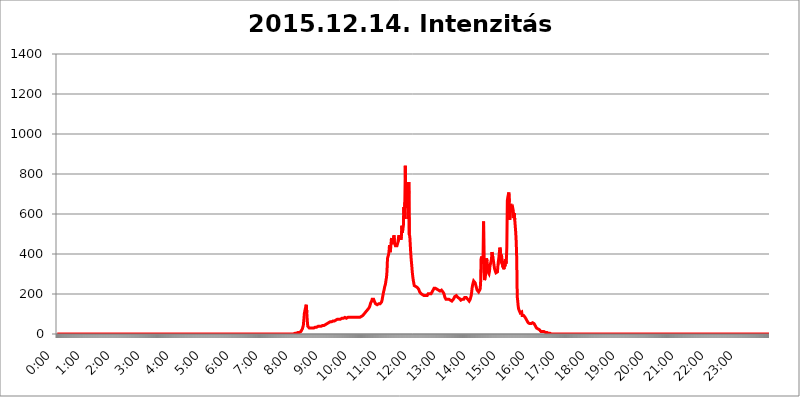
| Category | 2015.12.14. Intenzitás [W/m^2] |
|---|---|
| 0.0 | 0 |
| 0.0006944444444444445 | 0 |
| 0.001388888888888889 | 0 |
| 0.0020833333333333333 | 0 |
| 0.002777777777777778 | 0 |
| 0.003472222222222222 | 0 |
| 0.004166666666666667 | 0 |
| 0.004861111111111111 | 0 |
| 0.005555555555555556 | 0 |
| 0.0062499999999999995 | 0 |
| 0.006944444444444444 | 0 |
| 0.007638888888888889 | 0 |
| 0.008333333333333333 | 0 |
| 0.009027777777777779 | 0 |
| 0.009722222222222222 | 0 |
| 0.010416666666666666 | 0 |
| 0.011111111111111112 | 0 |
| 0.011805555555555555 | 0 |
| 0.012499999999999999 | 0 |
| 0.013194444444444444 | 0 |
| 0.013888888888888888 | 0 |
| 0.014583333333333332 | 0 |
| 0.015277777777777777 | 0 |
| 0.015972222222222224 | 0 |
| 0.016666666666666666 | 0 |
| 0.017361111111111112 | 0 |
| 0.018055555555555557 | 0 |
| 0.01875 | 0 |
| 0.019444444444444445 | 0 |
| 0.02013888888888889 | 0 |
| 0.020833333333333332 | 0 |
| 0.02152777777777778 | 0 |
| 0.022222222222222223 | 0 |
| 0.02291666666666667 | 0 |
| 0.02361111111111111 | 0 |
| 0.024305555555555556 | 0 |
| 0.024999999999999998 | 0 |
| 0.025694444444444447 | 0 |
| 0.02638888888888889 | 0 |
| 0.027083333333333334 | 0 |
| 0.027777777777777776 | 0 |
| 0.02847222222222222 | 0 |
| 0.029166666666666664 | 0 |
| 0.029861111111111113 | 0 |
| 0.030555555555555555 | 0 |
| 0.03125 | 0 |
| 0.03194444444444445 | 0 |
| 0.03263888888888889 | 0 |
| 0.03333333333333333 | 0 |
| 0.034027777777777775 | 0 |
| 0.034722222222222224 | 0 |
| 0.035416666666666666 | 0 |
| 0.036111111111111115 | 0 |
| 0.03680555555555556 | 0 |
| 0.0375 | 0 |
| 0.03819444444444444 | 0 |
| 0.03888888888888889 | 0 |
| 0.03958333333333333 | 0 |
| 0.04027777777777778 | 0 |
| 0.04097222222222222 | 0 |
| 0.041666666666666664 | 0 |
| 0.042361111111111106 | 0 |
| 0.04305555555555556 | 0 |
| 0.043750000000000004 | 0 |
| 0.044444444444444446 | 0 |
| 0.04513888888888889 | 0 |
| 0.04583333333333334 | 0 |
| 0.04652777777777778 | 0 |
| 0.04722222222222222 | 0 |
| 0.04791666666666666 | 0 |
| 0.04861111111111111 | 0 |
| 0.049305555555555554 | 0 |
| 0.049999999999999996 | 0 |
| 0.05069444444444445 | 0 |
| 0.051388888888888894 | 0 |
| 0.052083333333333336 | 0 |
| 0.05277777777777778 | 0 |
| 0.05347222222222222 | 0 |
| 0.05416666666666667 | 0 |
| 0.05486111111111111 | 0 |
| 0.05555555555555555 | 0 |
| 0.05625 | 0 |
| 0.05694444444444444 | 0 |
| 0.057638888888888885 | 0 |
| 0.05833333333333333 | 0 |
| 0.05902777777777778 | 0 |
| 0.059722222222222225 | 0 |
| 0.06041666666666667 | 0 |
| 0.061111111111111116 | 0 |
| 0.06180555555555556 | 0 |
| 0.0625 | 0 |
| 0.06319444444444444 | 0 |
| 0.06388888888888888 | 0 |
| 0.06458333333333334 | 0 |
| 0.06527777777777778 | 0 |
| 0.06597222222222222 | 0 |
| 0.06666666666666667 | 0 |
| 0.06736111111111111 | 0 |
| 0.06805555555555555 | 0 |
| 0.06874999999999999 | 0 |
| 0.06944444444444443 | 0 |
| 0.07013888888888889 | 0 |
| 0.07083333333333333 | 0 |
| 0.07152777777777779 | 0 |
| 0.07222222222222223 | 0 |
| 0.07291666666666667 | 0 |
| 0.07361111111111111 | 0 |
| 0.07430555555555556 | 0 |
| 0.075 | 0 |
| 0.07569444444444444 | 0 |
| 0.0763888888888889 | 0 |
| 0.07708333333333334 | 0 |
| 0.07777777777777778 | 0 |
| 0.07847222222222222 | 0 |
| 0.07916666666666666 | 0 |
| 0.0798611111111111 | 0 |
| 0.08055555555555556 | 0 |
| 0.08125 | 0 |
| 0.08194444444444444 | 0 |
| 0.08263888888888889 | 0 |
| 0.08333333333333333 | 0 |
| 0.08402777777777777 | 0 |
| 0.08472222222222221 | 0 |
| 0.08541666666666665 | 0 |
| 0.08611111111111112 | 0 |
| 0.08680555555555557 | 0 |
| 0.08750000000000001 | 0 |
| 0.08819444444444445 | 0 |
| 0.08888888888888889 | 0 |
| 0.08958333333333333 | 0 |
| 0.09027777777777778 | 0 |
| 0.09097222222222222 | 0 |
| 0.09166666666666667 | 0 |
| 0.09236111111111112 | 0 |
| 0.09305555555555556 | 0 |
| 0.09375 | 0 |
| 0.09444444444444444 | 0 |
| 0.09513888888888888 | 0 |
| 0.09583333333333333 | 0 |
| 0.09652777777777777 | 0 |
| 0.09722222222222222 | 0 |
| 0.09791666666666667 | 0 |
| 0.09861111111111111 | 0 |
| 0.09930555555555555 | 0 |
| 0.09999999999999999 | 0 |
| 0.10069444444444443 | 0 |
| 0.1013888888888889 | 0 |
| 0.10208333333333335 | 0 |
| 0.10277777777777779 | 0 |
| 0.10347222222222223 | 0 |
| 0.10416666666666667 | 0 |
| 0.10486111111111111 | 0 |
| 0.10555555555555556 | 0 |
| 0.10625 | 0 |
| 0.10694444444444444 | 0 |
| 0.1076388888888889 | 0 |
| 0.10833333333333334 | 0 |
| 0.10902777777777778 | 0 |
| 0.10972222222222222 | 0 |
| 0.1111111111111111 | 0 |
| 0.11180555555555556 | 0 |
| 0.11180555555555556 | 0 |
| 0.1125 | 0 |
| 0.11319444444444444 | 0 |
| 0.11388888888888889 | 0 |
| 0.11458333333333333 | 0 |
| 0.11527777777777777 | 0 |
| 0.11597222222222221 | 0 |
| 0.11666666666666665 | 0 |
| 0.1173611111111111 | 0 |
| 0.11805555555555557 | 0 |
| 0.11944444444444445 | 0 |
| 0.12013888888888889 | 0 |
| 0.12083333333333333 | 0 |
| 0.12152777777777778 | 0 |
| 0.12222222222222223 | 0 |
| 0.12291666666666667 | 0 |
| 0.12291666666666667 | 0 |
| 0.12361111111111112 | 0 |
| 0.12430555555555556 | 0 |
| 0.125 | 0 |
| 0.12569444444444444 | 0 |
| 0.12638888888888888 | 0 |
| 0.12708333333333333 | 0 |
| 0.16875 | 0 |
| 0.12847222222222224 | 0 |
| 0.12916666666666668 | 0 |
| 0.12986111111111112 | 0 |
| 0.13055555555555556 | 0 |
| 0.13125 | 0 |
| 0.13194444444444445 | 0 |
| 0.1326388888888889 | 0 |
| 0.13333333333333333 | 0 |
| 0.13402777777777777 | 0 |
| 0.13402777777777777 | 0 |
| 0.13472222222222222 | 0 |
| 0.13541666666666666 | 0 |
| 0.1361111111111111 | 0 |
| 0.13749999999999998 | 0 |
| 0.13819444444444443 | 0 |
| 0.1388888888888889 | 0 |
| 0.13958333333333334 | 0 |
| 0.14027777777777778 | 0 |
| 0.14097222222222222 | 0 |
| 0.14166666666666666 | 0 |
| 0.1423611111111111 | 0 |
| 0.14305555555555557 | 0 |
| 0.14375000000000002 | 0 |
| 0.14444444444444446 | 0 |
| 0.1451388888888889 | 0 |
| 0.1451388888888889 | 0 |
| 0.14652777777777778 | 0 |
| 0.14722222222222223 | 0 |
| 0.14791666666666667 | 0 |
| 0.1486111111111111 | 0 |
| 0.14930555555555555 | 0 |
| 0.15 | 0 |
| 0.15069444444444444 | 0 |
| 0.15138888888888888 | 0 |
| 0.15208333333333332 | 0 |
| 0.15277777777777776 | 0 |
| 0.15347222222222223 | 0 |
| 0.15416666666666667 | 0 |
| 0.15486111111111112 | 0 |
| 0.15555555555555556 | 0 |
| 0.15625 | 0 |
| 0.15694444444444444 | 0 |
| 0.15763888888888888 | 0 |
| 0.15833333333333333 | 0 |
| 0.15902777777777777 | 0 |
| 0.15972222222222224 | 0 |
| 0.16041666666666668 | 0 |
| 0.16111111111111112 | 0 |
| 0.16180555555555556 | 0 |
| 0.1625 | 0 |
| 0.16319444444444445 | 0 |
| 0.1638888888888889 | 0 |
| 0.16458333333333333 | 0 |
| 0.16527777777777777 | 0 |
| 0.16597222222222222 | 0 |
| 0.16666666666666666 | 0 |
| 0.1673611111111111 | 0 |
| 0.16805555555555554 | 0 |
| 0.16874999999999998 | 0 |
| 0.16944444444444443 | 0 |
| 0.17013888888888887 | 0 |
| 0.1708333333333333 | 0 |
| 0.17152777777777775 | 0 |
| 0.17222222222222225 | 0 |
| 0.1729166666666667 | 0 |
| 0.17361111111111113 | 0 |
| 0.17430555555555557 | 0 |
| 0.17500000000000002 | 0 |
| 0.17569444444444446 | 0 |
| 0.1763888888888889 | 0 |
| 0.17708333333333334 | 0 |
| 0.17777777777777778 | 0 |
| 0.17847222222222223 | 0 |
| 0.17916666666666667 | 0 |
| 0.1798611111111111 | 0 |
| 0.18055555555555555 | 0 |
| 0.18125 | 0 |
| 0.18194444444444444 | 0 |
| 0.1826388888888889 | 0 |
| 0.18333333333333335 | 0 |
| 0.1840277777777778 | 0 |
| 0.18472222222222223 | 0 |
| 0.18541666666666667 | 0 |
| 0.18611111111111112 | 0 |
| 0.18680555555555556 | 0 |
| 0.1875 | 0 |
| 0.18819444444444444 | 0 |
| 0.18888888888888888 | 0 |
| 0.18958333333333333 | 0 |
| 0.19027777777777777 | 0 |
| 0.1909722222222222 | 0 |
| 0.19166666666666665 | 0 |
| 0.19236111111111112 | 0 |
| 0.19305555555555554 | 0 |
| 0.19375 | 0 |
| 0.19444444444444445 | 0 |
| 0.1951388888888889 | 0 |
| 0.19583333333333333 | 0 |
| 0.19652777777777777 | 0 |
| 0.19722222222222222 | 0 |
| 0.19791666666666666 | 0 |
| 0.1986111111111111 | 0 |
| 0.19930555555555554 | 0 |
| 0.19999999999999998 | 0 |
| 0.20069444444444443 | 0 |
| 0.20138888888888887 | 0 |
| 0.2020833333333333 | 0 |
| 0.2027777777777778 | 0 |
| 0.2034722222222222 | 0 |
| 0.2041666666666667 | 0 |
| 0.20486111111111113 | 0 |
| 0.20555555555555557 | 0 |
| 0.20625000000000002 | 0 |
| 0.20694444444444446 | 0 |
| 0.2076388888888889 | 0 |
| 0.20833333333333334 | 0 |
| 0.20902777777777778 | 0 |
| 0.20972222222222223 | 0 |
| 0.21041666666666667 | 0 |
| 0.2111111111111111 | 0 |
| 0.21180555555555555 | 0 |
| 0.2125 | 0 |
| 0.21319444444444444 | 0 |
| 0.2138888888888889 | 0 |
| 0.21458333333333335 | 0 |
| 0.2152777777777778 | 0 |
| 0.21597222222222223 | 0 |
| 0.21666666666666667 | 0 |
| 0.21736111111111112 | 0 |
| 0.21805555555555556 | 0 |
| 0.21875 | 0 |
| 0.21944444444444444 | 0 |
| 0.22013888888888888 | 0 |
| 0.22083333333333333 | 0 |
| 0.22152777777777777 | 0 |
| 0.2222222222222222 | 0 |
| 0.22291666666666665 | 0 |
| 0.2236111111111111 | 0 |
| 0.22430555555555556 | 0 |
| 0.225 | 0 |
| 0.22569444444444445 | 0 |
| 0.2263888888888889 | 0 |
| 0.22708333333333333 | 0 |
| 0.22777777777777777 | 0 |
| 0.22847222222222222 | 0 |
| 0.22916666666666666 | 0 |
| 0.2298611111111111 | 0 |
| 0.23055555555555554 | 0 |
| 0.23124999999999998 | 0 |
| 0.23194444444444443 | 0 |
| 0.23263888888888887 | 0 |
| 0.2333333333333333 | 0 |
| 0.2340277777777778 | 0 |
| 0.2347222222222222 | 0 |
| 0.2354166666666667 | 0 |
| 0.23611111111111113 | 0 |
| 0.23680555555555557 | 0 |
| 0.23750000000000002 | 0 |
| 0.23819444444444446 | 0 |
| 0.2388888888888889 | 0 |
| 0.23958333333333334 | 0 |
| 0.24027777777777778 | 0 |
| 0.24097222222222223 | 0 |
| 0.24166666666666667 | 0 |
| 0.2423611111111111 | 0 |
| 0.24305555555555555 | 0 |
| 0.24375 | 0 |
| 0.24444444444444446 | 0 |
| 0.24513888888888888 | 0 |
| 0.24583333333333335 | 0 |
| 0.2465277777777778 | 0 |
| 0.24722222222222223 | 0 |
| 0.24791666666666667 | 0 |
| 0.24861111111111112 | 0 |
| 0.24930555555555556 | 0 |
| 0.25 | 0 |
| 0.25069444444444444 | 0 |
| 0.2513888888888889 | 0 |
| 0.2520833333333333 | 0 |
| 0.25277777777777777 | 0 |
| 0.2534722222222222 | 0 |
| 0.25416666666666665 | 0 |
| 0.2548611111111111 | 0 |
| 0.2555555555555556 | 0 |
| 0.25625000000000003 | 0 |
| 0.2569444444444445 | 0 |
| 0.2576388888888889 | 0 |
| 0.25833333333333336 | 0 |
| 0.2590277777777778 | 0 |
| 0.25972222222222224 | 0 |
| 0.2604166666666667 | 0 |
| 0.2611111111111111 | 0 |
| 0.26180555555555557 | 0 |
| 0.2625 | 0 |
| 0.26319444444444445 | 0 |
| 0.2638888888888889 | 0 |
| 0.26458333333333334 | 0 |
| 0.2652777777777778 | 0 |
| 0.2659722222222222 | 0 |
| 0.26666666666666666 | 0 |
| 0.2673611111111111 | 0 |
| 0.26805555555555555 | 0 |
| 0.26875 | 0 |
| 0.26944444444444443 | 0 |
| 0.2701388888888889 | 0 |
| 0.2708333333333333 | 0 |
| 0.27152777777777776 | 0 |
| 0.2722222222222222 | 0 |
| 0.27291666666666664 | 0 |
| 0.2736111111111111 | 0 |
| 0.2743055555555555 | 0 |
| 0.27499999999999997 | 0 |
| 0.27569444444444446 | 0 |
| 0.27638888888888885 | 0 |
| 0.27708333333333335 | 0 |
| 0.2777777777777778 | 0 |
| 0.27847222222222223 | 0 |
| 0.2791666666666667 | 0 |
| 0.2798611111111111 | 0 |
| 0.28055555555555556 | 0 |
| 0.28125 | 0 |
| 0.28194444444444444 | 0 |
| 0.2826388888888889 | 0 |
| 0.2833333333333333 | 0 |
| 0.28402777777777777 | 0 |
| 0.2847222222222222 | 0 |
| 0.28541666666666665 | 0 |
| 0.28611111111111115 | 0 |
| 0.28680555555555554 | 0 |
| 0.28750000000000003 | 0 |
| 0.2881944444444445 | 0 |
| 0.2888888888888889 | 0 |
| 0.28958333333333336 | 0 |
| 0.2902777777777778 | 0 |
| 0.29097222222222224 | 0 |
| 0.2916666666666667 | 0 |
| 0.2923611111111111 | 0 |
| 0.29305555555555557 | 0 |
| 0.29375 | 0 |
| 0.29444444444444445 | 0 |
| 0.2951388888888889 | 0 |
| 0.29583333333333334 | 0 |
| 0.2965277777777778 | 0 |
| 0.2972222222222222 | 0 |
| 0.29791666666666666 | 0 |
| 0.2986111111111111 | 0 |
| 0.29930555555555555 | 0 |
| 0.3 | 0 |
| 0.30069444444444443 | 0 |
| 0.3013888888888889 | 0 |
| 0.3020833333333333 | 0 |
| 0.30277777777777776 | 0 |
| 0.3034722222222222 | 0 |
| 0.30416666666666664 | 0 |
| 0.3048611111111111 | 0 |
| 0.3055555555555555 | 0 |
| 0.30624999999999997 | 0 |
| 0.3069444444444444 | 0 |
| 0.3076388888888889 | 0 |
| 0.30833333333333335 | 0 |
| 0.3090277777777778 | 0 |
| 0.30972222222222223 | 0 |
| 0.3104166666666667 | 0 |
| 0.3111111111111111 | 0 |
| 0.31180555555555556 | 0 |
| 0.3125 | 0 |
| 0.31319444444444444 | 0 |
| 0.3138888888888889 | 0 |
| 0.3145833333333333 | 0 |
| 0.31527777777777777 | 0 |
| 0.3159722222222222 | 0 |
| 0.31666666666666665 | 0 |
| 0.31736111111111115 | 0 |
| 0.31805555555555554 | 0 |
| 0.31875000000000003 | 0 |
| 0.3194444444444445 | 0 |
| 0.3201388888888889 | 0 |
| 0.32083333333333336 | 0 |
| 0.3215277777777778 | 0 |
| 0.32222222222222224 | 0 |
| 0.3229166666666667 | 0 |
| 0.3236111111111111 | 0 |
| 0.32430555555555557 | 0 |
| 0.325 | 0 |
| 0.32569444444444445 | 0 |
| 0.3263888888888889 | 0 |
| 0.32708333333333334 | 0 |
| 0.3277777777777778 | 0 |
| 0.3284722222222222 | 0 |
| 0.32916666666666666 | 0 |
| 0.3298611111111111 | 0 |
| 0.33055555555555555 | 0 |
| 0.33125 | 0 |
| 0.33194444444444443 | 0 |
| 0.3326388888888889 | 3.525 |
| 0.3333333333333333 | 3.525 |
| 0.3340277777777778 | 3.525 |
| 0.3347222222222222 | 3.525 |
| 0.3354166666666667 | 3.525 |
| 0.3361111111111111 | 3.525 |
| 0.3368055555555556 | 3.525 |
| 0.33749999999999997 | 7.887 |
| 0.33819444444444446 | 7.887 |
| 0.33888888888888885 | 7.887 |
| 0.33958333333333335 | 7.887 |
| 0.34027777777777773 | 7.887 |
| 0.34097222222222223 | 12.257 |
| 0.3416666666666666 | 12.257 |
| 0.3423611111111111 | 12.257 |
| 0.3430555555555555 | 16.636 |
| 0.34375 | 25.419 |
| 0.3444444444444445 | 34.234 |
| 0.3451388888888889 | 43.079 |
| 0.3458333333333334 | 69.775 |
| 0.34652777777777777 | 101.184 |
| 0.34722222222222227 | 114.716 |
| 0.34791666666666665 | 119.235 |
| 0.34861111111111115 | 137.347 |
| 0.34930555555555554 | 146.423 |
| 0.35000000000000003 | 105.69 |
| 0.3506944444444444 | 65.31 |
| 0.3513888888888889 | 38.653 |
| 0.3520833333333333 | 38.653 |
| 0.3527777777777778 | 34.234 |
| 0.3534722222222222 | 29.823 |
| 0.3541666666666667 | 29.823 |
| 0.3548611111111111 | 29.823 |
| 0.35555555555555557 | 29.823 |
| 0.35625 | 29.823 |
| 0.35694444444444445 | 29.823 |
| 0.3576388888888889 | 29.823 |
| 0.35833333333333334 | 29.823 |
| 0.3590277777777778 | 29.823 |
| 0.3597222222222222 | 29.823 |
| 0.36041666666666666 | 29.823 |
| 0.3611111111111111 | 29.823 |
| 0.36180555555555555 | 34.234 |
| 0.3625 | 34.234 |
| 0.36319444444444443 | 34.234 |
| 0.3638888888888889 | 34.234 |
| 0.3645833333333333 | 34.234 |
| 0.3652777777777778 | 38.653 |
| 0.3659722222222222 | 38.653 |
| 0.3666666666666667 | 38.653 |
| 0.3673611111111111 | 38.653 |
| 0.3680555555555556 | 38.653 |
| 0.36874999999999997 | 38.653 |
| 0.36944444444444446 | 38.653 |
| 0.37013888888888885 | 38.653 |
| 0.37083333333333335 | 38.653 |
| 0.37152777777777773 | 38.653 |
| 0.37222222222222223 | 43.079 |
| 0.3729166666666666 | 43.079 |
| 0.3736111111111111 | 43.079 |
| 0.3743055555555555 | 43.079 |
| 0.375 | 47.511 |
| 0.3756944444444445 | 47.511 |
| 0.3763888888888889 | 47.511 |
| 0.3770833333333334 | 47.511 |
| 0.37777777777777777 | 51.951 |
| 0.37847222222222227 | 51.951 |
| 0.37916666666666665 | 56.398 |
| 0.37986111111111115 | 56.398 |
| 0.38055555555555554 | 56.398 |
| 0.38125000000000003 | 56.398 |
| 0.3819444444444444 | 60.85 |
| 0.3826388888888889 | 60.85 |
| 0.3833333333333333 | 60.85 |
| 0.3840277777777778 | 60.85 |
| 0.3847222222222222 | 60.85 |
| 0.3854166666666667 | 60.85 |
| 0.3861111111111111 | 60.85 |
| 0.38680555555555557 | 65.31 |
| 0.3875 | 65.31 |
| 0.38819444444444445 | 65.31 |
| 0.3888888888888889 | 65.31 |
| 0.38958333333333334 | 69.775 |
| 0.3902777777777778 | 69.775 |
| 0.3909722222222222 | 69.775 |
| 0.39166666666666666 | 74.246 |
| 0.3923611111111111 | 74.246 |
| 0.39305555555555555 | 74.246 |
| 0.39375 | 74.246 |
| 0.39444444444444443 | 74.246 |
| 0.3951388888888889 | 74.246 |
| 0.3958333333333333 | 74.246 |
| 0.3965277777777778 | 74.246 |
| 0.3972222222222222 | 74.246 |
| 0.3979166666666667 | 74.246 |
| 0.3986111111111111 | 74.246 |
| 0.3993055555555556 | 78.722 |
| 0.39999999999999997 | 78.722 |
| 0.40069444444444446 | 78.722 |
| 0.40138888888888885 | 78.722 |
| 0.40208333333333335 | 78.722 |
| 0.40277777777777773 | 78.722 |
| 0.40347222222222223 | 83.205 |
| 0.4041666666666666 | 83.205 |
| 0.4048611111111111 | 83.205 |
| 0.4055555555555555 | 78.722 |
| 0.40625 | 78.722 |
| 0.4069444444444445 | 83.205 |
| 0.4076388888888889 | 83.205 |
| 0.4083333333333334 | 83.205 |
| 0.40902777777777777 | 83.205 |
| 0.40972222222222227 | 83.205 |
| 0.41041666666666665 | 83.205 |
| 0.41111111111111115 | 83.205 |
| 0.41180555555555554 | 83.205 |
| 0.41250000000000003 | 83.205 |
| 0.4131944444444444 | 83.205 |
| 0.4138888888888889 | 83.205 |
| 0.4145833333333333 | 83.205 |
| 0.4152777777777778 | 83.205 |
| 0.4159722222222222 | 83.205 |
| 0.4166666666666667 | 83.205 |
| 0.4173611111111111 | 83.205 |
| 0.41805555555555557 | 83.205 |
| 0.41875 | 83.205 |
| 0.41944444444444445 | 83.205 |
| 0.4201388888888889 | 83.205 |
| 0.42083333333333334 | 83.205 |
| 0.4215277777777778 | 83.205 |
| 0.4222222222222222 | 83.205 |
| 0.42291666666666666 | 83.205 |
| 0.4236111111111111 | 83.205 |
| 0.42430555555555555 | 83.205 |
| 0.425 | 83.205 |
| 0.42569444444444443 | 87.692 |
| 0.4263888888888889 | 87.692 |
| 0.4270833333333333 | 92.184 |
| 0.4277777777777778 | 92.184 |
| 0.4284722222222222 | 92.184 |
| 0.4291666666666667 | 96.682 |
| 0.4298611111111111 | 96.682 |
| 0.4305555555555556 | 101.184 |
| 0.43124999999999997 | 105.69 |
| 0.43194444444444446 | 105.69 |
| 0.43263888888888885 | 110.201 |
| 0.43333333333333335 | 110.201 |
| 0.43402777777777773 | 114.716 |
| 0.43472222222222223 | 119.235 |
| 0.4354166666666666 | 119.235 |
| 0.4361111111111111 | 123.758 |
| 0.4368055555555555 | 128.284 |
| 0.4375 | 132.814 |
| 0.4381944444444445 | 137.347 |
| 0.4388888888888889 | 146.423 |
| 0.4395833333333334 | 155.509 |
| 0.44027777777777777 | 160.056 |
| 0.44097222222222227 | 164.605 |
| 0.44166666666666665 | 173.709 |
| 0.44236111111111115 | 173.709 |
| 0.44305555555555554 | 173.709 |
| 0.44375000000000003 | 173.709 |
| 0.4444444444444444 | 169.156 |
| 0.4451388888888889 | 160.056 |
| 0.4458333333333333 | 155.509 |
| 0.4465277777777778 | 150.964 |
| 0.4472222222222222 | 146.423 |
| 0.4479166666666667 | 146.423 |
| 0.4486111111111111 | 146.423 |
| 0.44930555555555557 | 146.423 |
| 0.45 | 146.423 |
| 0.45069444444444445 | 150.964 |
| 0.4513888888888889 | 150.964 |
| 0.45208333333333334 | 150.964 |
| 0.4527777777777778 | 150.964 |
| 0.4534722222222222 | 150.964 |
| 0.45416666666666666 | 150.964 |
| 0.4548611111111111 | 160.056 |
| 0.45555555555555555 | 169.156 |
| 0.45625 | 182.82 |
| 0.45694444444444443 | 196.497 |
| 0.4576388888888889 | 210.182 |
| 0.4583333333333333 | 219.309 |
| 0.4590277777777778 | 233 |
| 0.4597222222222222 | 242.127 |
| 0.4604166666666667 | 251.251 |
| 0.4611111111111111 | 269.49 |
| 0.4618055555555556 | 283.156 |
| 0.46249999999999997 | 314.98 |
| 0.46319444444444446 | 378.224 |
| 0.46388888888888885 | 387.202 |
| 0.46458333333333335 | 396.164 |
| 0.46527777777777773 | 409.574 |
| 0.46597222222222223 | 445.129 |
| 0.4666666666666666 | 409.574 |
| 0.4673611111111111 | 418.492 |
| 0.4680555555555555 | 449.551 |
| 0.46875 | 480.356 |
| 0.4694444444444445 | 449.551 |
| 0.4701388888888889 | 449.551 |
| 0.4708333333333334 | 462.786 |
| 0.47152777777777777 | 471.582 |
| 0.47222222222222227 | 493.475 |
| 0.47291666666666665 | 458.38 |
| 0.47361111111111115 | 449.551 |
| 0.47430555555555554 | 440.702 |
| 0.47500000000000003 | 440.702 |
| 0.4756944444444444 | 436.27 |
| 0.4763888888888889 | 440.702 |
| 0.4770833333333333 | 445.129 |
| 0.4777777777777778 | 458.38 |
| 0.4784722222222222 | 475.972 |
| 0.4791666666666667 | 493.475 |
| 0.4798611111111111 | 484.735 |
| 0.48055555555555557 | 493.475 |
| 0.48125 | 497.836 |
| 0.48194444444444445 | 471.582 |
| 0.4826388888888889 | 489.108 |
| 0.48333333333333334 | 541.121 |
| 0.4840277777777778 | 506.542 |
| 0.4847222222222222 | 528.2 |
| 0.48541666666666666 | 536.82 |
| 0.4861111111111111 | 634.105 |
| 0.48680555555555555 | 575.299 |
| 0.4875 | 658.909 |
| 0.48819444444444443 | 841.526 |
| 0.4888888888888889 | 642.4 |
| 0.4895833333333333 | 650.667 |
| 0.4902777777777778 | 755.766 |
| 0.4909722222222222 | 727.896 |
| 0.4916666666666667 | 575.299 |
| 0.4923611111111111 | 583.779 |
| 0.4930555555555556 | 759.723 |
| 0.49374999999999997 | 497.836 |
| 0.49444444444444446 | 489.108 |
| 0.49513888888888885 | 493.475 |
| 0.49583333333333335 | 400.638 |
| 0.49652777777777773 | 369.23 |
| 0.49722222222222223 | 342.162 |
| 0.4979166666666666 | 310.44 |
| 0.4986111111111111 | 287.709 |
| 0.4993055555555555 | 269.49 |
| 0.5 | 255.813 |
| 0.5006944444444444 | 242.127 |
| 0.5013888888888889 | 237.564 |
| 0.5020833333333333 | 237.564 |
| 0.5027777777777778 | 237.564 |
| 0.5034722222222222 | 233 |
| 0.5041666666666667 | 233 |
| 0.5048611111111111 | 233 |
| 0.5055555555555555 | 233 |
| 0.50625 | 228.436 |
| 0.5069444444444444 | 223.873 |
| 0.5076388888888889 | 219.309 |
| 0.5083333333333333 | 210.182 |
| 0.5090277777777777 | 210.182 |
| 0.5097222222222222 | 205.62 |
| 0.5104166666666666 | 201.058 |
| 0.5111111111111112 | 201.058 |
| 0.5118055555555555 | 196.497 |
| 0.5125000000000001 | 196.497 |
| 0.5131944444444444 | 191.937 |
| 0.513888888888889 | 191.937 |
| 0.5145833333333333 | 191.937 |
| 0.5152777777777778 | 191.937 |
| 0.5159722222222222 | 191.937 |
| 0.5166666666666667 | 191.937 |
| 0.517361111111111 | 191.937 |
| 0.5180555555555556 | 187.378 |
| 0.5187499999999999 | 191.937 |
| 0.5194444444444445 | 196.497 |
| 0.5201388888888888 | 201.058 |
| 0.5208333333333334 | 201.058 |
| 0.5215277777777778 | 201.058 |
| 0.5222222222222223 | 201.058 |
| 0.5229166666666667 | 201.058 |
| 0.5236111111111111 | 201.058 |
| 0.5243055555555556 | 201.058 |
| 0.525 | 205.62 |
| 0.5256944444444445 | 210.182 |
| 0.5263888888888889 | 214.746 |
| 0.5270833333333333 | 219.309 |
| 0.5277777777777778 | 223.873 |
| 0.5284722222222222 | 228.436 |
| 0.5291666666666667 | 228.436 |
| 0.5298611111111111 | 228.436 |
| 0.5305555555555556 | 228.436 |
| 0.53125 | 228.436 |
| 0.5319444444444444 | 223.873 |
| 0.5326388888888889 | 223.873 |
| 0.5333333333333333 | 223.873 |
| 0.5340277777777778 | 223.873 |
| 0.5347222222222222 | 219.309 |
| 0.5354166666666667 | 214.746 |
| 0.5361111111111111 | 214.746 |
| 0.5368055555555555 | 214.746 |
| 0.5375 | 214.746 |
| 0.5381944444444444 | 214.746 |
| 0.5388888888888889 | 219.309 |
| 0.5395833333333333 | 214.746 |
| 0.5402777777777777 | 214.746 |
| 0.5409722222222222 | 210.182 |
| 0.5416666666666666 | 205.62 |
| 0.5423611111111112 | 201.058 |
| 0.5430555555555555 | 191.937 |
| 0.5437500000000001 | 182.82 |
| 0.5444444444444444 | 178.264 |
| 0.545138888888889 | 173.709 |
| 0.5458333333333333 | 173.709 |
| 0.5465277777777778 | 169.156 |
| 0.5472222222222222 | 173.709 |
| 0.5479166666666667 | 173.709 |
| 0.548611111111111 | 173.709 |
| 0.5493055555555556 | 173.709 |
| 0.5499999999999999 | 173.709 |
| 0.5506944444444445 | 173.709 |
| 0.5513888888888888 | 169.156 |
| 0.5520833333333334 | 169.156 |
| 0.5527777777777778 | 164.605 |
| 0.5534722222222223 | 164.605 |
| 0.5541666666666667 | 169.156 |
| 0.5548611111111111 | 169.156 |
| 0.5555555555555556 | 173.709 |
| 0.55625 | 178.264 |
| 0.5569444444444445 | 178.264 |
| 0.5576388888888889 | 187.378 |
| 0.5583333333333333 | 187.378 |
| 0.5590277777777778 | 191.937 |
| 0.5597222222222222 | 191.937 |
| 0.5604166666666667 | 191.937 |
| 0.5611111111111111 | 187.378 |
| 0.5618055555555556 | 182.82 |
| 0.5625 | 178.264 |
| 0.5631944444444444 | 178.264 |
| 0.5638888888888889 | 178.264 |
| 0.5645833333333333 | 178.264 |
| 0.5652777777777778 | 173.709 |
| 0.5659722222222222 | 169.156 |
| 0.5666666666666667 | 169.156 |
| 0.5673611111111111 | 169.156 |
| 0.5680555555555555 | 173.709 |
| 0.56875 | 173.709 |
| 0.5694444444444444 | 173.709 |
| 0.5701388888888889 | 173.709 |
| 0.5708333333333333 | 178.264 |
| 0.5715277777777777 | 182.82 |
| 0.5722222222222222 | 182.82 |
| 0.5729166666666666 | 187.378 |
| 0.5736111111111112 | 182.82 |
| 0.5743055555555555 | 182.82 |
| 0.5750000000000001 | 178.264 |
| 0.5756944444444444 | 173.709 |
| 0.576388888888889 | 169.156 |
| 0.5770833333333333 | 169.156 |
| 0.5777777777777778 | 164.605 |
| 0.5784722222222222 | 164.605 |
| 0.5791666666666667 | 173.709 |
| 0.579861111111111 | 182.82 |
| 0.5805555555555556 | 191.937 |
| 0.5812499999999999 | 210.182 |
| 0.5819444444444445 | 233 |
| 0.5826388888888888 | 246.689 |
| 0.5833333333333334 | 255.813 |
| 0.5840277777777778 | 264.932 |
| 0.5847222222222223 | 269.49 |
| 0.5854166666666667 | 264.932 |
| 0.5861111111111111 | 255.813 |
| 0.5868055555555556 | 246.689 |
| 0.5875 | 237.564 |
| 0.5881944444444445 | 228.436 |
| 0.5888888888888889 | 219.309 |
| 0.5895833333333333 | 214.746 |
| 0.5902777777777778 | 214.746 |
| 0.5909722222222222 | 210.182 |
| 0.5916666666666667 | 210.182 |
| 0.5923611111111111 | 214.746 |
| 0.5930555555555556 | 223.873 |
| 0.59375 | 251.251 |
| 0.5944444444444444 | 373.729 |
| 0.5951388888888889 | 387.202 |
| 0.5958333333333333 | 364.728 |
| 0.5965277777777778 | 351.198 |
| 0.5972222222222222 | 387.202 |
| 0.5979166666666667 | 562.53 |
| 0.5986111111111111 | 305.898 |
| 0.5993055555555555 | 269.49 |
| 0.6 | 278.603 |
| 0.6006944444444444 | 278.603 |
| 0.6013888888888889 | 310.44 |
| 0.6020833333333333 | 378.224 |
| 0.6027777777777777 | 364.728 |
| 0.6034722222222222 | 333.113 |
| 0.6041666666666666 | 310.44 |
| 0.6048611111111112 | 305.898 |
| 0.6055555555555555 | 301.354 |
| 0.6062500000000001 | 314.98 |
| 0.6069444444444444 | 342.162 |
| 0.607638888888889 | 351.198 |
| 0.6083333333333333 | 346.682 |
| 0.6090277777777778 | 373.729 |
| 0.6097222222222222 | 409.574 |
| 0.6104166666666667 | 414.035 |
| 0.611111111111111 | 378.224 |
| 0.6118055555555556 | 364.728 |
| 0.6124999999999999 | 369.23 |
| 0.6131944444444445 | 328.584 |
| 0.6138888888888888 | 319.517 |
| 0.6145833333333334 | 314.98 |
| 0.6152777777777778 | 305.898 |
| 0.6159722222222223 | 301.354 |
| 0.6166666666666667 | 301.354 |
| 0.6173611111111111 | 310.44 |
| 0.6180555555555556 | 342.162 |
| 0.61875 | 364.728 |
| 0.6194444444444445 | 382.715 |
| 0.6201388888888889 | 409.574 |
| 0.6208333333333333 | 431.833 |
| 0.6215277777777778 | 418.492 |
| 0.6222222222222222 | 369.23 |
| 0.6229166666666667 | 364.728 |
| 0.6236111111111111 | 378.224 |
| 0.6243055555555556 | 355.712 |
| 0.625 | 333.113 |
| 0.6256944444444444 | 364.728 |
| 0.6263888888888889 | 324.052 |
| 0.6270833333333333 | 364.728 |
| 0.6277777777777778 | 337.639 |
| 0.6284722222222222 | 373.729 |
| 0.6291666666666667 | 351.198 |
| 0.6298611111111111 | 364.728 |
| 0.6305555555555555 | 436.27 |
| 0.63125 | 667.123 |
| 0.6319444444444444 | 683.473 |
| 0.6326388888888889 | 695.666 |
| 0.6333333333333333 | 707.8 |
| 0.6340277777777777 | 658.909 |
| 0.6347222222222222 | 571.049 |
| 0.6354166666666666 | 642.4 |
| 0.6361111111111112 | 650.667 |
| 0.6368055555555555 | 638.256 |
| 0.6375000000000001 | 621.613 |
| 0.6381944444444444 | 617.436 |
| 0.638888888888889 | 629.948 |
| 0.6395833333333333 | 617.436 |
| 0.6402777777777778 | 579.542 |
| 0.6409722222222222 | 604.864 |
| 0.6416666666666667 | 571.049 |
| 0.642361111111111 | 566.793 |
| 0.6430555555555556 | 506.542 |
| 0.6437499999999999 | 458.38 |
| 0.6444444444444445 | 373.729 |
| 0.6451388888888888 | 187.378 |
| 0.6458333333333334 | 164.605 |
| 0.6465277777777778 | 137.347 |
| 0.6472222222222223 | 123.758 |
| 0.6479166666666667 | 119.235 |
| 0.6486111111111111 | 119.235 |
| 0.6493055555555556 | 105.69 |
| 0.65 | 101.184 |
| 0.6506944444444445 | 101.184 |
| 0.6513888888888889 | 110.201 |
| 0.6520833333333333 | 92.184 |
| 0.6527777777777778 | 87.692 |
| 0.6534722222222222 | 87.692 |
| 0.6541666666666667 | 92.184 |
| 0.6548611111111111 | 92.184 |
| 0.6555555555555556 | 87.692 |
| 0.65625 | 83.205 |
| 0.6569444444444444 | 78.722 |
| 0.6576388888888889 | 74.246 |
| 0.6583333333333333 | 69.775 |
| 0.6590277777777778 | 65.31 |
| 0.6597222222222222 | 60.85 |
| 0.6604166666666667 | 56.398 |
| 0.6611111111111111 | 56.398 |
| 0.6618055555555555 | 51.951 |
| 0.6625 | 51.951 |
| 0.6631944444444444 | 51.951 |
| 0.6638888888888889 | 51.951 |
| 0.6645833333333333 | 51.951 |
| 0.6652777777777777 | 51.951 |
| 0.6659722222222222 | 56.398 |
| 0.6666666666666666 | 56.398 |
| 0.6673611111111111 | 56.398 |
| 0.6680555555555556 | 51.951 |
| 0.6687500000000001 | 51.951 |
| 0.6694444444444444 | 56.398 |
| 0.6701388888888888 | 51.951 |
| 0.6708333333333334 | 38.653 |
| 0.6715277777777778 | 34.234 |
| 0.6722222222222222 | 29.823 |
| 0.6729166666666666 | 29.823 |
| 0.6736111111111112 | 25.419 |
| 0.6743055555555556 | 25.419 |
| 0.6749999999999999 | 21.024 |
| 0.6756944444444444 | 21.024 |
| 0.6763888888888889 | 21.024 |
| 0.6770833333333334 | 16.636 |
| 0.6777777777777777 | 16.636 |
| 0.6784722222222223 | 12.257 |
| 0.6791666666666667 | 12.257 |
| 0.6798611111111111 | 12.257 |
| 0.6805555555555555 | 12.257 |
| 0.68125 | 12.257 |
| 0.6819444444444445 | 12.257 |
| 0.6826388888888889 | 12.257 |
| 0.6833333333333332 | 12.257 |
| 0.6840277777777778 | 7.887 |
| 0.6847222222222222 | 7.887 |
| 0.6854166666666667 | 7.887 |
| 0.686111111111111 | 7.887 |
| 0.6868055555555556 | 7.887 |
| 0.6875 | 3.525 |
| 0.6881944444444444 | 3.525 |
| 0.688888888888889 | 3.525 |
| 0.6895833333333333 | 3.525 |
| 0.6902777777777778 | 3.525 |
| 0.6909722222222222 | 3.525 |
| 0.6916666666666668 | 3.525 |
| 0.6923611111111111 | 0 |
| 0.6930555555555555 | 0 |
| 0.69375 | 0 |
| 0.6944444444444445 | 0 |
| 0.6951388888888889 | 0 |
| 0.6958333333333333 | 0 |
| 0.6965277777777777 | 0 |
| 0.6972222222222223 | 0 |
| 0.6979166666666666 | 0 |
| 0.6986111111111111 | 0 |
| 0.6993055555555556 | 0 |
| 0.7000000000000001 | 0 |
| 0.7006944444444444 | 0 |
| 0.7013888888888888 | 0 |
| 0.7020833333333334 | 0 |
| 0.7027777777777778 | 0 |
| 0.7034722222222222 | 0 |
| 0.7041666666666666 | 0 |
| 0.7048611111111112 | 0 |
| 0.7055555555555556 | 0 |
| 0.7062499999999999 | 0 |
| 0.7069444444444444 | 0 |
| 0.7076388888888889 | 0 |
| 0.7083333333333334 | 0 |
| 0.7090277777777777 | 0 |
| 0.7097222222222223 | 0 |
| 0.7104166666666667 | 0 |
| 0.7111111111111111 | 0 |
| 0.7118055555555555 | 0 |
| 0.7125 | 0 |
| 0.7131944444444445 | 0 |
| 0.7138888888888889 | 0 |
| 0.7145833333333332 | 0 |
| 0.7152777777777778 | 0 |
| 0.7159722222222222 | 0 |
| 0.7166666666666667 | 0 |
| 0.717361111111111 | 0 |
| 0.7180555555555556 | 0 |
| 0.71875 | 0 |
| 0.7194444444444444 | 0 |
| 0.720138888888889 | 0 |
| 0.7208333333333333 | 0 |
| 0.7215277777777778 | 0 |
| 0.7222222222222222 | 0 |
| 0.7229166666666668 | 0 |
| 0.7236111111111111 | 0 |
| 0.7243055555555555 | 0 |
| 0.725 | 0 |
| 0.7256944444444445 | 0 |
| 0.7263888888888889 | 0 |
| 0.7270833333333333 | 0 |
| 0.7277777777777777 | 0 |
| 0.7284722222222223 | 0 |
| 0.7291666666666666 | 0 |
| 0.7298611111111111 | 0 |
| 0.7305555555555556 | 0 |
| 0.7312500000000001 | 0 |
| 0.7319444444444444 | 0 |
| 0.7326388888888888 | 0 |
| 0.7333333333333334 | 0 |
| 0.7340277777777778 | 0 |
| 0.7347222222222222 | 0 |
| 0.7354166666666666 | 0 |
| 0.7361111111111112 | 0 |
| 0.7368055555555556 | 0 |
| 0.7374999999999999 | 0 |
| 0.7381944444444444 | 0 |
| 0.7388888888888889 | 0 |
| 0.7395833333333334 | 0 |
| 0.7402777777777777 | 0 |
| 0.7409722222222223 | 0 |
| 0.7416666666666667 | 0 |
| 0.7423611111111111 | 0 |
| 0.7430555555555555 | 0 |
| 0.74375 | 0 |
| 0.7444444444444445 | 0 |
| 0.7451388888888889 | 0 |
| 0.7458333333333332 | 0 |
| 0.7465277777777778 | 0 |
| 0.7472222222222222 | 0 |
| 0.7479166666666667 | 0 |
| 0.748611111111111 | 0 |
| 0.7493055555555556 | 0 |
| 0.75 | 0 |
| 0.7506944444444444 | 0 |
| 0.751388888888889 | 0 |
| 0.7520833333333333 | 0 |
| 0.7527777777777778 | 0 |
| 0.7534722222222222 | 0 |
| 0.7541666666666668 | 0 |
| 0.7548611111111111 | 0 |
| 0.7555555555555555 | 0 |
| 0.75625 | 0 |
| 0.7569444444444445 | 0 |
| 0.7576388888888889 | 0 |
| 0.7583333333333333 | 0 |
| 0.7590277777777777 | 0 |
| 0.7597222222222223 | 0 |
| 0.7604166666666666 | 0 |
| 0.7611111111111111 | 0 |
| 0.7618055555555556 | 0 |
| 0.7625000000000001 | 0 |
| 0.7631944444444444 | 0 |
| 0.7638888888888888 | 0 |
| 0.7645833333333334 | 0 |
| 0.7652777777777778 | 0 |
| 0.7659722222222222 | 0 |
| 0.7666666666666666 | 0 |
| 0.7673611111111112 | 0 |
| 0.7680555555555556 | 0 |
| 0.7687499999999999 | 0 |
| 0.7694444444444444 | 0 |
| 0.7701388888888889 | 0 |
| 0.7708333333333334 | 0 |
| 0.7715277777777777 | 0 |
| 0.7722222222222223 | 0 |
| 0.7729166666666667 | 0 |
| 0.7736111111111111 | 0 |
| 0.7743055555555555 | 0 |
| 0.775 | 0 |
| 0.7756944444444445 | 0 |
| 0.7763888888888889 | 0 |
| 0.7770833333333332 | 0 |
| 0.7777777777777778 | 0 |
| 0.7784722222222222 | 0 |
| 0.7791666666666667 | 0 |
| 0.779861111111111 | 0 |
| 0.7805555555555556 | 0 |
| 0.78125 | 0 |
| 0.7819444444444444 | 0 |
| 0.782638888888889 | 0 |
| 0.7833333333333333 | 0 |
| 0.7840277777777778 | 0 |
| 0.7847222222222222 | 0 |
| 0.7854166666666668 | 0 |
| 0.7861111111111111 | 0 |
| 0.7868055555555555 | 0 |
| 0.7875 | 0 |
| 0.7881944444444445 | 0 |
| 0.7888888888888889 | 0 |
| 0.7895833333333333 | 0 |
| 0.7902777777777777 | 0 |
| 0.7909722222222223 | 0 |
| 0.7916666666666666 | 0 |
| 0.7923611111111111 | 0 |
| 0.7930555555555556 | 0 |
| 0.7937500000000001 | 0 |
| 0.7944444444444444 | 0 |
| 0.7951388888888888 | 0 |
| 0.7958333333333334 | 0 |
| 0.7965277777777778 | 0 |
| 0.7972222222222222 | 0 |
| 0.7979166666666666 | 0 |
| 0.7986111111111112 | 0 |
| 0.7993055555555556 | 0 |
| 0.7999999999999999 | 0 |
| 0.8006944444444444 | 0 |
| 0.8013888888888889 | 0 |
| 0.8020833333333334 | 0 |
| 0.8027777777777777 | 0 |
| 0.8034722222222223 | 0 |
| 0.8041666666666667 | 0 |
| 0.8048611111111111 | 0 |
| 0.8055555555555555 | 0 |
| 0.80625 | 0 |
| 0.8069444444444445 | 0 |
| 0.8076388888888889 | 0 |
| 0.8083333333333332 | 0 |
| 0.8090277777777778 | 0 |
| 0.8097222222222222 | 0 |
| 0.8104166666666667 | 0 |
| 0.811111111111111 | 0 |
| 0.8118055555555556 | 0 |
| 0.8125 | 0 |
| 0.8131944444444444 | 0 |
| 0.813888888888889 | 0 |
| 0.8145833333333333 | 0 |
| 0.8152777777777778 | 0 |
| 0.8159722222222222 | 0 |
| 0.8166666666666668 | 0 |
| 0.8173611111111111 | 0 |
| 0.8180555555555555 | 0 |
| 0.81875 | 0 |
| 0.8194444444444445 | 0 |
| 0.8201388888888889 | 0 |
| 0.8208333333333333 | 0 |
| 0.8215277777777777 | 0 |
| 0.8222222222222223 | 0 |
| 0.8229166666666666 | 0 |
| 0.8236111111111111 | 0 |
| 0.8243055555555556 | 0 |
| 0.8250000000000001 | 0 |
| 0.8256944444444444 | 0 |
| 0.8263888888888888 | 0 |
| 0.8270833333333334 | 0 |
| 0.8277777777777778 | 0 |
| 0.8284722222222222 | 0 |
| 0.8291666666666666 | 0 |
| 0.8298611111111112 | 0 |
| 0.8305555555555556 | 0 |
| 0.8312499999999999 | 0 |
| 0.8319444444444444 | 0 |
| 0.8326388888888889 | 0 |
| 0.8333333333333334 | 0 |
| 0.8340277777777777 | 0 |
| 0.8347222222222223 | 0 |
| 0.8354166666666667 | 0 |
| 0.8361111111111111 | 0 |
| 0.8368055555555555 | 0 |
| 0.8375 | 0 |
| 0.8381944444444445 | 0 |
| 0.8388888888888889 | 0 |
| 0.8395833333333332 | 0 |
| 0.8402777777777778 | 0 |
| 0.8409722222222222 | 0 |
| 0.8416666666666667 | 0 |
| 0.842361111111111 | 0 |
| 0.8430555555555556 | 0 |
| 0.84375 | 0 |
| 0.8444444444444444 | 0 |
| 0.845138888888889 | 0 |
| 0.8458333333333333 | 0 |
| 0.8465277777777778 | 0 |
| 0.8472222222222222 | 0 |
| 0.8479166666666668 | 0 |
| 0.8486111111111111 | 0 |
| 0.8493055555555555 | 0 |
| 0.85 | 0 |
| 0.8506944444444445 | 0 |
| 0.8513888888888889 | 0 |
| 0.8520833333333333 | 0 |
| 0.8527777777777777 | 0 |
| 0.8534722222222223 | 0 |
| 0.8541666666666666 | 0 |
| 0.8548611111111111 | 0 |
| 0.8555555555555556 | 0 |
| 0.8562500000000001 | 0 |
| 0.8569444444444444 | 0 |
| 0.8576388888888888 | 0 |
| 0.8583333333333334 | 0 |
| 0.8590277777777778 | 0 |
| 0.8597222222222222 | 0 |
| 0.8604166666666666 | 0 |
| 0.8611111111111112 | 0 |
| 0.8618055555555556 | 0 |
| 0.8624999999999999 | 0 |
| 0.8631944444444444 | 0 |
| 0.8638888888888889 | 0 |
| 0.8645833333333334 | 0 |
| 0.8652777777777777 | 0 |
| 0.8659722222222223 | 0 |
| 0.8666666666666667 | 0 |
| 0.8673611111111111 | 0 |
| 0.8680555555555555 | 0 |
| 0.86875 | 0 |
| 0.8694444444444445 | 0 |
| 0.8701388888888889 | 0 |
| 0.8708333333333332 | 0 |
| 0.8715277777777778 | 0 |
| 0.8722222222222222 | 0 |
| 0.8729166666666667 | 0 |
| 0.873611111111111 | 0 |
| 0.8743055555555556 | 0 |
| 0.875 | 0 |
| 0.8756944444444444 | 0 |
| 0.876388888888889 | 0 |
| 0.8770833333333333 | 0 |
| 0.8777777777777778 | 0 |
| 0.8784722222222222 | 0 |
| 0.8791666666666668 | 0 |
| 0.8798611111111111 | 0 |
| 0.8805555555555555 | 0 |
| 0.88125 | 0 |
| 0.8819444444444445 | 0 |
| 0.8826388888888889 | 0 |
| 0.8833333333333333 | 0 |
| 0.8840277777777777 | 0 |
| 0.8847222222222223 | 0 |
| 0.8854166666666666 | 0 |
| 0.8861111111111111 | 0 |
| 0.8868055555555556 | 0 |
| 0.8875000000000001 | 0 |
| 0.8881944444444444 | 0 |
| 0.8888888888888888 | 0 |
| 0.8895833333333334 | 0 |
| 0.8902777777777778 | 0 |
| 0.8909722222222222 | 0 |
| 0.8916666666666666 | 0 |
| 0.8923611111111112 | 0 |
| 0.8930555555555556 | 0 |
| 0.8937499999999999 | 0 |
| 0.8944444444444444 | 0 |
| 0.8951388888888889 | 0 |
| 0.8958333333333334 | 0 |
| 0.8965277777777777 | 0 |
| 0.8972222222222223 | 0 |
| 0.8979166666666667 | 0 |
| 0.8986111111111111 | 0 |
| 0.8993055555555555 | 0 |
| 0.9 | 0 |
| 0.9006944444444445 | 0 |
| 0.9013888888888889 | 0 |
| 0.9020833333333332 | 0 |
| 0.9027777777777778 | 0 |
| 0.9034722222222222 | 0 |
| 0.9041666666666667 | 0 |
| 0.904861111111111 | 0 |
| 0.9055555555555556 | 0 |
| 0.90625 | 0 |
| 0.9069444444444444 | 0 |
| 0.907638888888889 | 0 |
| 0.9083333333333333 | 0 |
| 0.9090277777777778 | 0 |
| 0.9097222222222222 | 0 |
| 0.9104166666666668 | 0 |
| 0.9111111111111111 | 0 |
| 0.9118055555555555 | 0 |
| 0.9125 | 0 |
| 0.9131944444444445 | 0 |
| 0.9138888888888889 | 0 |
| 0.9145833333333333 | 0 |
| 0.9152777777777777 | 0 |
| 0.9159722222222223 | 0 |
| 0.9166666666666666 | 0 |
| 0.9173611111111111 | 0 |
| 0.9180555555555556 | 0 |
| 0.9187500000000001 | 0 |
| 0.9194444444444444 | 0 |
| 0.9201388888888888 | 0 |
| 0.9208333333333334 | 0 |
| 0.9215277777777778 | 0 |
| 0.9222222222222222 | 0 |
| 0.9229166666666666 | 0 |
| 0.9236111111111112 | 0 |
| 0.9243055555555556 | 0 |
| 0.9249999999999999 | 0 |
| 0.9256944444444444 | 0 |
| 0.9263888888888889 | 0 |
| 0.9270833333333334 | 0 |
| 0.9277777777777777 | 0 |
| 0.9284722222222223 | 0 |
| 0.9291666666666667 | 0 |
| 0.9298611111111111 | 0 |
| 0.9305555555555555 | 0 |
| 0.93125 | 0 |
| 0.9319444444444445 | 0 |
| 0.9326388888888889 | 0 |
| 0.9333333333333332 | 0 |
| 0.9340277777777778 | 0 |
| 0.9347222222222222 | 0 |
| 0.9354166666666667 | 0 |
| 0.936111111111111 | 0 |
| 0.9368055555555556 | 0 |
| 0.9375 | 0 |
| 0.9381944444444444 | 0 |
| 0.938888888888889 | 0 |
| 0.9395833333333333 | 0 |
| 0.9402777777777778 | 0 |
| 0.9409722222222222 | 0 |
| 0.9416666666666668 | 0 |
| 0.9423611111111111 | 0 |
| 0.9430555555555555 | 0 |
| 0.94375 | 0 |
| 0.9444444444444445 | 0 |
| 0.9451388888888889 | 0 |
| 0.9458333333333333 | 0 |
| 0.9465277777777777 | 0 |
| 0.9472222222222223 | 0 |
| 0.9479166666666666 | 0 |
| 0.9486111111111111 | 0 |
| 0.9493055555555556 | 0 |
| 0.9500000000000001 | 0 |
| 0.9506944444444444 | 0 |
| 0.9513888888888888 | 0 |
| 0.9520833333333334 | 0 |
| 0.9527777777777778 | 0 |
| 0.9534722222222222 | 0 |
| 0.9541666666666666 | 0 |
| 0.9548611111111112 | 0 |
| 0.9555555555555556 | 0 |
| 0.9562499999999999 | 0 |
| 0.9569444444444444 | 0 |
| 0.9576388888888889 | 0 |
| 0.9583333333333334 | 0 |
| 0.9590277777777777 | 0 |
| 0.9597222222222223 | 0 |
| 0.9604166666666667 | 0 |
| 0.9611111111111111 | 0 |
| 0.9618055555555555 | 0 |
| 0.9625 | 0 |
| 0.9631944444444445 | 0 |
| 0.9638888888888889 | 0 |
| 0.9645833333333332 | 0 |
| 0.9652777777777778 | 0 |
| 0.9659722222222222 | 0 |
| 0.9666666666666667 | 0 |
| 0.967361111111111 | 0 |
| 0.9680555555555556 | 0 |
| 0.96875 | 0 |
| 0.9694444444444444 | 0 |
| 0.970138888888889 | 0 |
| 0.9708333333333333 | 0 |
| 0.9715277777777778 | 0 |
| 0.9722222222222222 | 0 |
| 0.9729166666666668 | 0 |
| 0.9736111111111111 | 0 |
| 0.9743055555555555 | 0 |
| 0.975 | 0 |
| 0.9756944444444445 | 0 |
| 0.9763888888888889 | 0 |
| 0.9770833333333333 | 0 |
| 0.9777777777777777 | 0 |
| 0.9784722222222223 | 0 |
| 0.9791666666666666 | 0 |
| 0.9798611111111111 | 0 |
| 0.9805555555555556 | 0 |
| 0.9812500000000001 | 0 |
| 0.9819444444444444 | 0 |
| 0.9826388888888888 | 0 |
| 0.9833333333333334 | 0 |
| 0.9840277777777778 | 0 |
| 0.9847222222222222 | 0 |
| 0.9854166666666666 | 0 |
| 0.9861111111111112 | 0 |
| 0.9868055555555556 | 0 |
| 0.9874999999999999 | 0 |
| 0.9881944444444444 | 0 |
| 0.9888888888888889 | 0 |
| 0.9895833333333334 | 0 |
| 0.9902777777777777 | 0 |
| 0.9909722222222223 | 0 |
| 0.9916666666666667 | 0 |
| 0.9923611111111111 | 0 |
| 0.9930555555555555 | 0 |
| 0.99375 | 0 |
| 0.9944444444444445 | 0 |
| 0.9951388888888889 | 0 |
| 0.9958333333333332 | 0 |
| 0.9965277777777778 | 0 |
| 0.9972222222222222 | 0 |
| 0.9979166666666667 | 0 |
| 0.998611111111111 | 0 |
| 0.9993055555555556 | 0 |